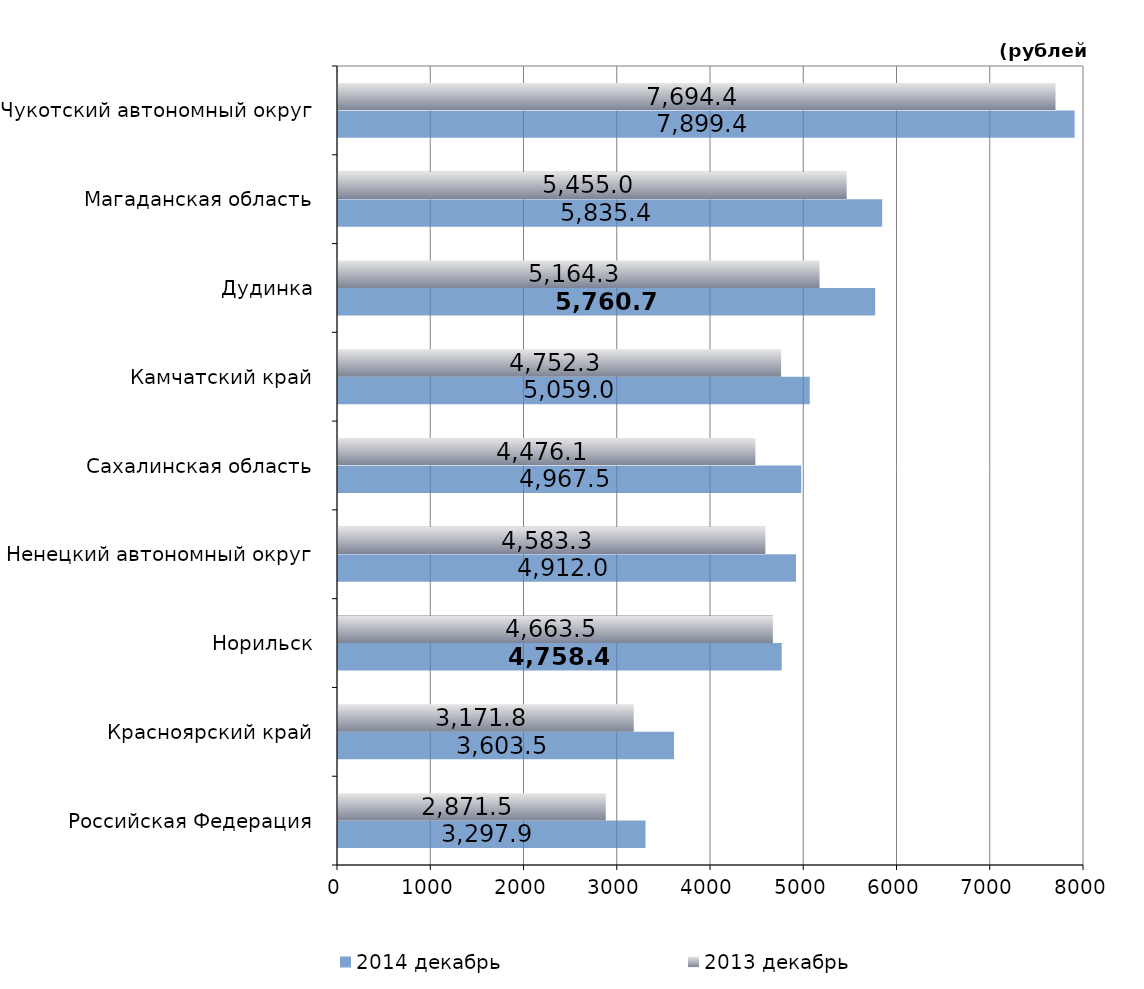
| Category | 2014 декабрь | 2013 декабрь |
|---|---|---|
| Российская Федерация | 3297.89 | 2871.48 |
| Красноярский край | 3603.54 | 3171.84 |
| Норильск | 4758.39 | 4663.5 |
| Ненецкий автономный округ | 4912.03 | 4583.26 |
| Сахалинская область | 4967.52 | 4476.08 |
| Камчатский край | 5059.03 | 4752.33 |
| Дудинка | 5760.67 | 5164.3 |
| Магаданская область | 5835.36 | 5454.98 |
| Чукотский автономный округ | 7899.38 | 7694.44 |